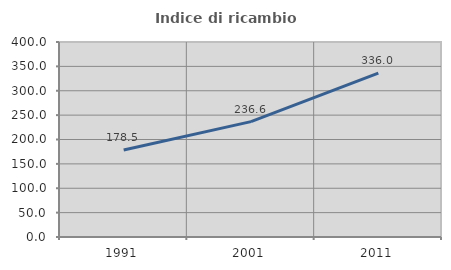
| Category | Indice di ricambio occupazionale  |
|---|---|
| 1991.0 | 178.53 |
| 2001.0 | 236.648 |
| 2011.0 | 336.017 |